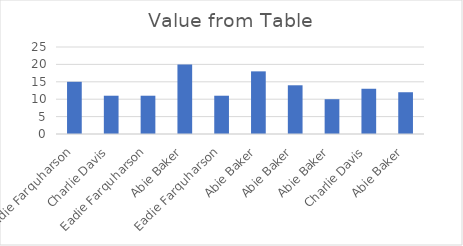
| Category | Value |
|---|---|
| Eadie Farquharson | 15 |
| Charlie Davis | 11 |
| Eadie Farquharson | 11 |
| Abie Baker | 20 |
| Eadie Farquharson | 11 |
| Abie Baker | 18 |
| Abie Baker | 14 |
| Abie Baker | 10 |
| Charlie Davis | 13 |
| Abie Baker | 12 |